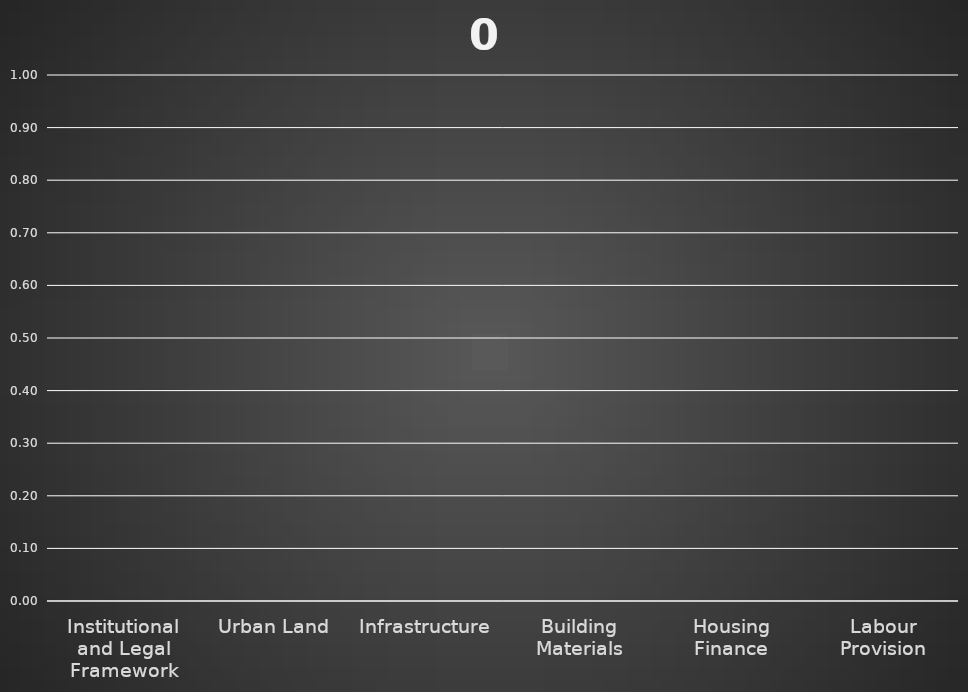
| Category | 0 |
|---|---|
| Institutional and Legal Framework | 0 |
| Urban Land | 0 |
| Infrastructure | 0 |
| Building Materials | 0 |
| Housing Finance | 0 |
| Labour Provision | 0 |